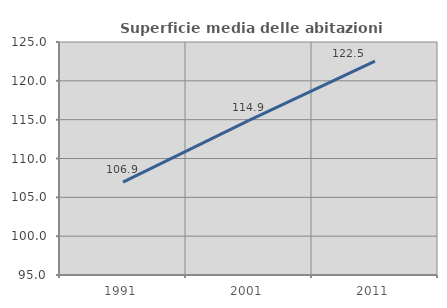
| Category | Superficie media delle abitazioni occupate |
|---|---|
| 1991.0 | 106.948 |
| 2001.0 | 114.904 |
| 2011.0 | 122.546 |